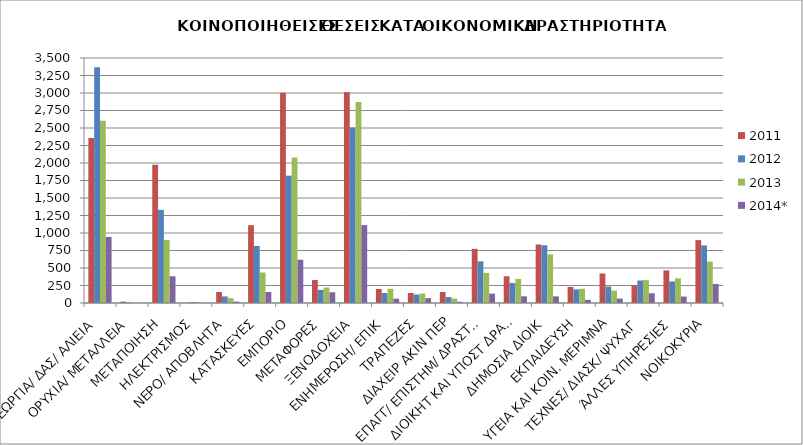
| Category | 2011 | 2012 | 2013 | 2014* |
|---|---|---|---|---|
| ΓΕΩΡΓΙΑ/ ΔΑΣ/ ΑΛΙΕΙΑ | 2358 | 3368 | 2605 | 944 |
| ΟΡΥΧΙΑ/ ΜΕΤΑΛΛΕΙΑ | 20 | 7 | 2 | 1 |
| ΜΕΤΑΠΟΙΗΣΗ | 1976 | 1330 | 901 | 382 |
| ΗΛΕΚΤΡΙΣΜΟΣ | 3 | 13 | 5 | 3 |
| ΝΕΡΟ/ ΑΠΟΒΛΗΤΑ | 157 | 94 | 69 | 19 |
| ΚΑΤΑΣΚΕΥΕΣ | 1112 | 815 | 436 | 158 |
| ΕΜΠΟΡΙΟ | 3005 | 1819 | 2077 | 618 |
| ΜΕΤΑΦΟΡΕΣ | 328 | 187 | 221 | 154 |
| ΞΕΝΟΔΟΧΕΙΑ | 3010 | 2507 | 2873 | 1113 |
| ΕΝΗΜΕΡΩΣΗ/ ΕΠΙΚ | 200 | 143 | 203 | 62 |
| ΤΡΑΠΕΖΕΣ | 143 | 121 | 134 | 70 |
| ΔΙΑΧΕΙΡ ΑΚΙΝ ΠΕΡ | 157 | 85 | 64 | 17 |
| ΕΠΑΓΓ/ ΕΠΙΣΤΗΜ/ ΔΡΑΣΤΗΡ | 774 | 595 | 430 | 134 |
| ΔΙΟΙΚΗΤ ΚΑΙ ΥΠΟΣΤ ΔΡΑΣΤΗΡ  | 382 | 285 | 343 | 96 |
| ΔΗΜΟΣΙΑ ΔΙΟΙΚ | 836 | 825 | 694 | 95 |
| ΕΚΠΑΙΔΕΥΣΗ | 230 | 195 | 204 | 45 |
| ΥΓΕΙΑ ΚΑΙ ΚΟΙΝ. ΜΕΡΙΜΝΑ | 422 | 235 | 178 | 63 |
| ΤΕΧΝΕΣ/ ΔΙΑΣΚ/ ΨΥΧΑΓ | 253 | 321 | 327 | 139 |
| ΆΛΛΕΣ ΥΠΗΡΕΣΙΕΣ | 466 | 308 | 352 | 92 |
| ΝΟΙΚΟΚΥΡΙΑ | 898 | 823 | 592 | 272 |